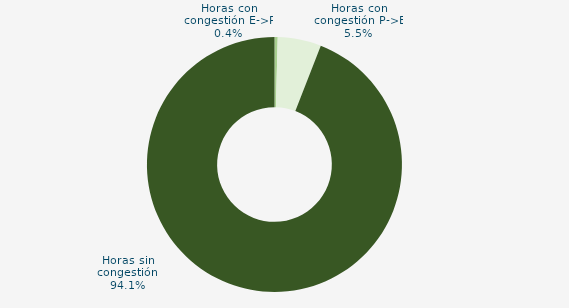
| Category | Horas con congestión E->P |
|---|---|
| Horas con congestión E->P | 0.403 |
| Horas con congestión P->E | 5.511 |
| Horas sin congestión | 94.086 |